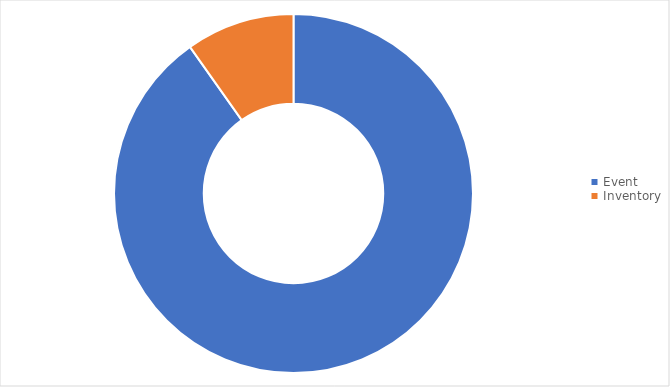
| Category | 2018-2019 |
|---|---|
| Event | 4506.07 |
| Inventory | 488.75 |